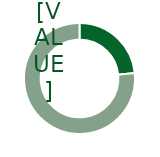
| Category | Series 0 |
|---|---|
| 0 | 0.234 |
| 1 | 0.766 |